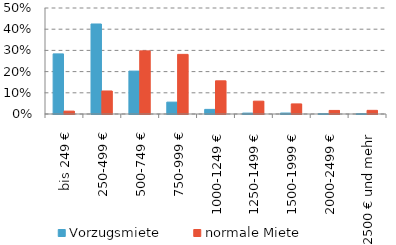
| Category | Vorzugsmiete | normale Miete |
|---|---|---|
| bis 249 € | 0.283 | 0.014 |
| 250-499 € | 0.425 | 0.109 |
| 500-749 € | 0.202 | 0.298 |
| 750-999 € | 0.056 | 0.281 |
| 1000-1249 € | 0.022 | 0.157 |
| 1250-1499 € | 0.004 | 0.061 |
| 1500-1999 € | 0.005 | 0.048 |
| 2000-2499 € | 0.002 | 0.017 |
| 2500 € und mehr | 0.002 | 0.017 |